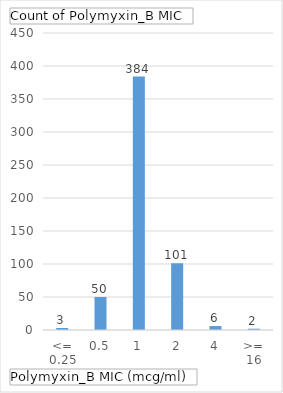
| Category | Total |
|---|---|
| <= 0.25 | 3 |
| 0.5 | 50 |
| 1 | 384 |
| 2 | 101 |
| 4 | 6 |
| >= 16 | 2 |